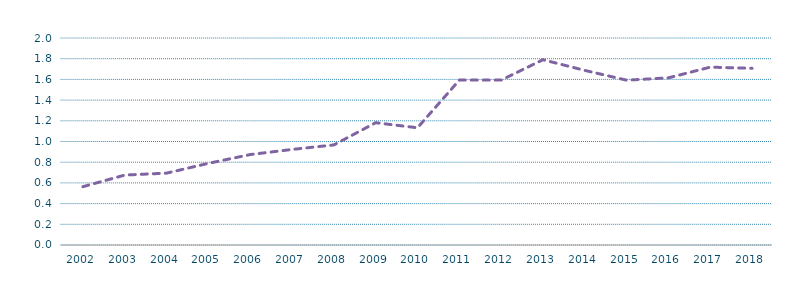
| Category | Generación resto de renovables/Generacion total (%) |
|---|---|
| 2002.0 | 0.563 |
| 2003.0 | 0.676 |
| 2004.0 | 0.694 |
| 2005.0 | 0.789 |
| 2006.0 | 0.874 |
| 2007.0 | 0.923 |
| 2008.0 | 0.967 |
| 2009.0 | 1.182 |
| 2010.0 | 1.132 |
| 2011.0 | 1.593 |
| 2012.0 | 1.593 |
| 2013.0 | 1.79 |
| 2014.0 | 1.687 |
| 2015.0 | 1.592 |
| 2016.0 | 1.615 |
| 2017.0 | 1.718 |
| 2018.0 | 1.707 |